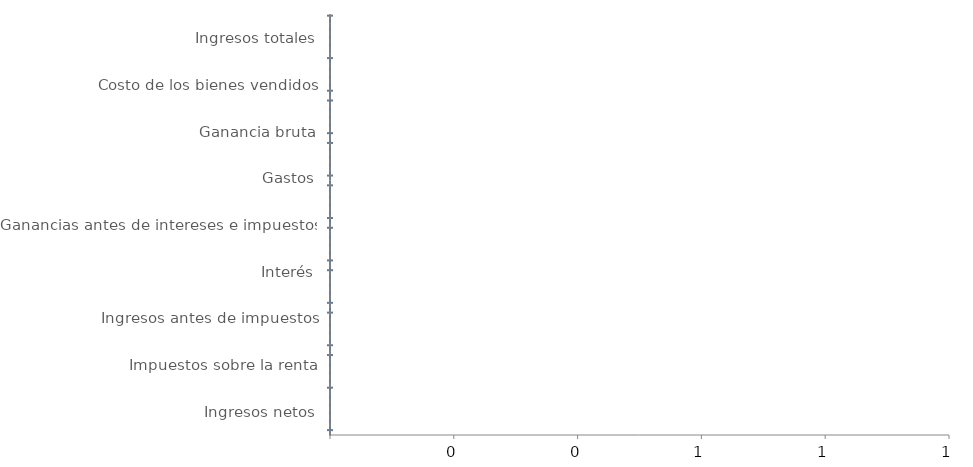
| Category | Finaliza | Blanco | Pérdida negativa | Ganancia negativa | Pérdida positiva | Ganancia positiva |
|---|---|---|---|---|---|---|
| Ingresos totales | 0 | 0 | 0 | 0 | 0 | 0 |
| Costo de los bienes vendidos | 0 | 0 | 0 | 0 | 0 | 0 |
| Ganancia bruta | 0 | 0 | 0 | 0 | 0 | 0 |
| Gastos | 0 | 0 | 0 | 0 | 0 | 0 |
| Ganancias antes de intereses e impuestos | 0 | 0 | 0 | 0 | 0 | 0 |
| Interés | 0 | 0 | 0 | 0 | 0 | 0 |
| Ingresos antes de impuestos | 0 | 0 | 0 | 0 | 0 | 0 |
| Impuestos sobre la renta | 0 | 0 | 0 | 0 | 0 | 0 |
| Ingresos netos | 0 | 0 | 0 | 0 | 0 | 0 |